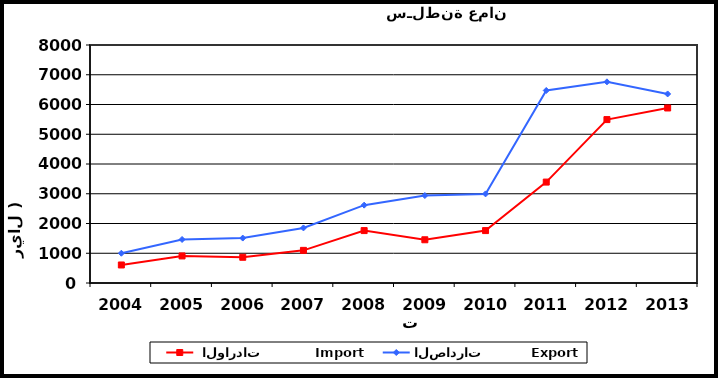
| Category |  الواردات           Import | الصادرات          Export |
|---|---|---|
| 2004.0 | 606 | 1001 |
| 2005.0 | 910 | 1463 |
| 2006.0 | 865 | 1510 |
| 2007.0 | 1097 | 1851 |
| 2008.0 | 1762 | 2617 |
| 2009.0 | 1453 | 2940 |
| 2010.0 | 1762 | 2995 |
| 2011.0 | 3392 | 6471 |
| 2012.0 | 5493 | 6762 |
| 2013.0 | 5883 | 6355 |